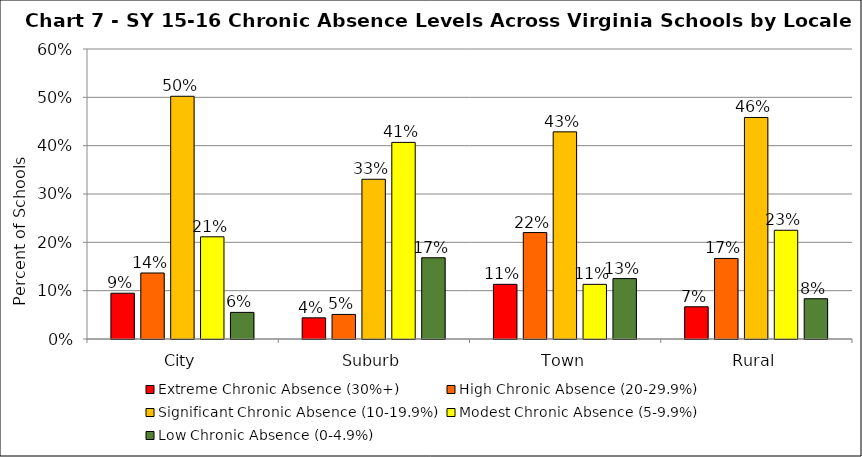
| Category | Extreme Chronic Absence (30%+) | High Chronic Absence (20-29.9%) | Significant Chronic Absence (10-19.9%) | Modest Chronic Absence (5-9.9%) | Low Chronic Absence (0-4.9%) |
|---|---|---|---|---|---|
| 0 | 0.095 | 0.137 | 0.502 | 0.211 | 0.055 |
| 1 | 0.044 | 0.051 | 0.331 | 0.407 | 0.168 |
| 2 | 0.113 | 0.22 | 0.429 | 0.113 | 0.125 |
| 3 | 0.067 | 0.167 | 0.458 | 0.225 | 0.083 |